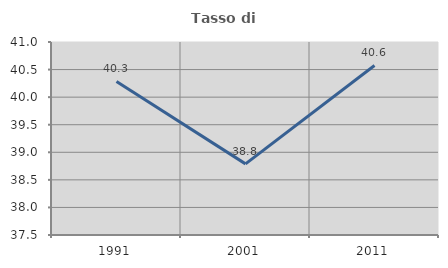
| Category | Tasso di occupazione   |
|---|---|
| 1991.0 | 40.284 |
| 2001.0 | 38.79 |
| 2011.0 | 40.575 |